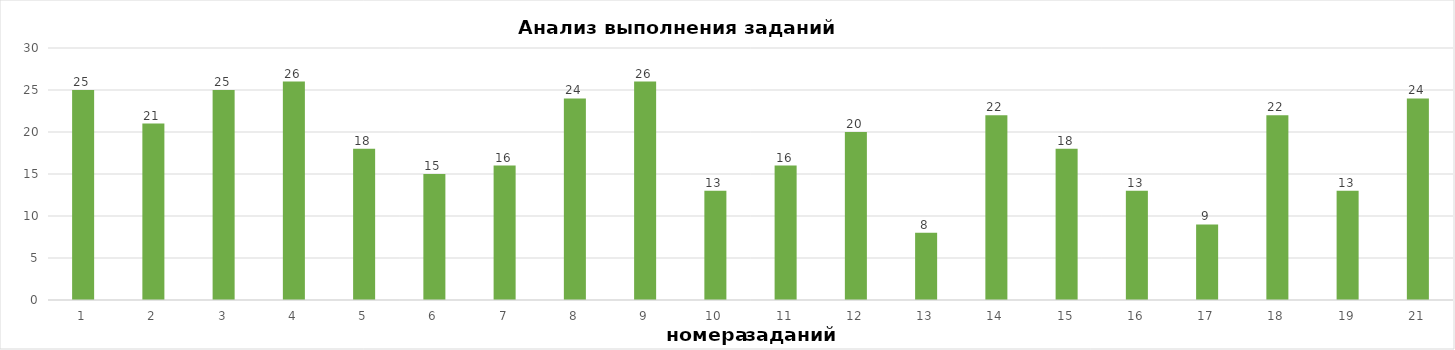
| Category | задания |
|---|---|
| 1.0 | 25 |
| 2.0 | 21 |
| 3.0 | 25 |
| 4.0 | 26 |
| 5.0 | 18 |
| 6.0 | 15 |
| 7.0 | 16 |
| 8.0 | 24 |
| 9.0 | 26 |
| 10.0 | 13 |
| 11.0 | 16 |
| 12.0 | 20 |
| 13.0 | 8 |
| 14.0 | 22 |
| 15.0 | 18 |
| 16.0 | 13 |
| 17.0 | 9 |
| 18.0 | 22 |
| 19.0 | 13 |
| 21.0 | 24 |